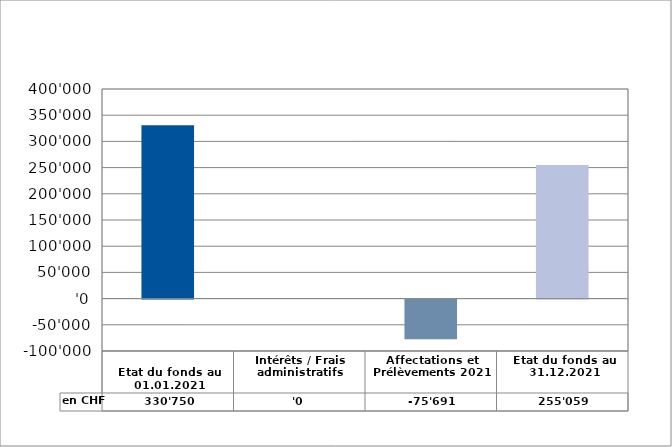
| Category | en CHF |
|---|---|
| 
Etat du fonds au 01.01.2021

 | 330750 |
| Intérêts / Frais administratifs | 0 |
| Affectations et Prélèvements 2021 | -75691 |
| Etat du fonds au 31.12.2021 | 255059 |